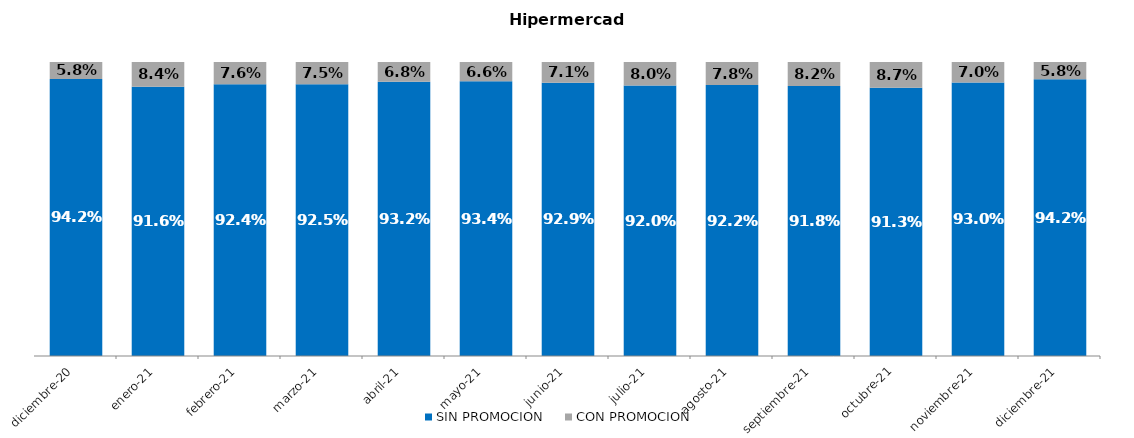
| Category | SIN PROMOCION   | CON PROMOCION   |
|---|---|---|
| 2020-12-01 | 0.942 | 0.058 |
| 2021-01-01 | 0.916 | 0.084 |
| 2021-02-01 | 0.924 | 0.076 |
| 2021-03-01 | 0.925 | 0.075 |
| 2021-04-01 | 0.932 | 0.068 |
| 2021-05-01 | 0.934 | 0.066 |
| 2021-06-01 | 0.929 | 0.071 |
| 2021-07-01 | 0.92 | 0.08 |
| 2021-08-01 | 0.922 | 0.078 |
| 2021-09-01 | 0.918 | 0.082 |
| 2021-10-01 | 0.913 | 0.087 |
| 2021-11-01 | 0.93 | 0.07 |
| 2021-12-01 | 0.942 | 0.058 |